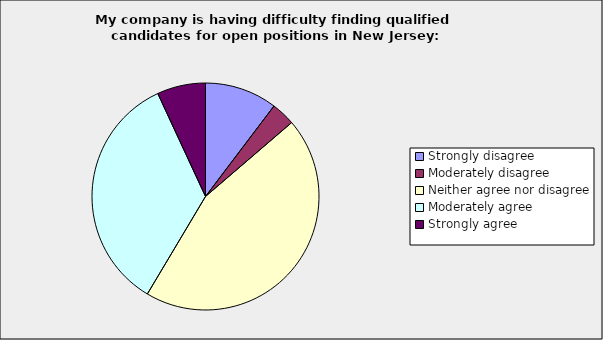
| Category | Series 0 |
|---|---|
| Strongly disagree | 0.103 |
| Moderately disagree | 0.034 |
| Neither agree nor disagree | 0.448 |
| Moderately agree | 0.345 |
| Strongly agree | 0.069 |